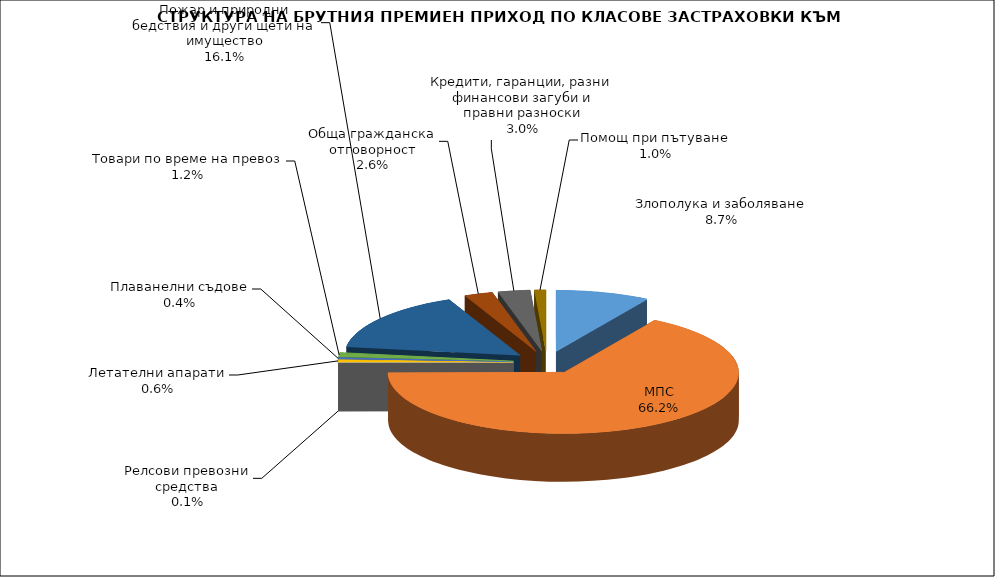
| Category | Злополука и заболяване МПС Релсови превозни средства Летателни апарати Плаванелни съдове Товари по време на превоз Пожар и природни бедствия и други щети на имущество Обща гражданска отговорност Кредити, гаранции, разни финансови загуби и правни разноски  |
|---|---|
| Злополука и заболяване | 0.087 |
| МПС | 0.662 |
| Релсови превозни средства | 0.001 |
| Летателни апарати | 0.006 |
| Плаванелни съдове | 0.004 |
| Товари по време на превоз | 0.012 |
| Пожар и природни бедствия и други щети на имущество | 0.161 |
| Обща гражданска отговорност | 0.026 |
| Кредити, гаранции, разни финансови загуби и правни разноски | 0.03 |
| Помощ при пътуване | 0.01 |